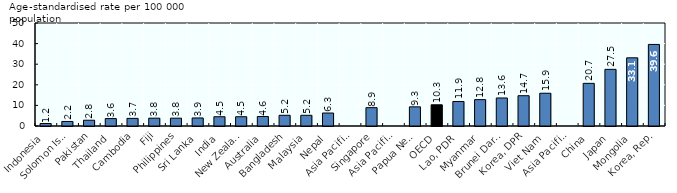
| Category | Total |
|---|---|
| Indonesia | 1.2 |
| Solomon Islands | 2.2 |
| Pakistan | 2.8 |
| Thailand | 3.6 |
| Cambodia | 3.7 |
| Fiji | 3.8 |
| Philippines | 3.8 |
| Sri Lanka | 3.9 |
| India | 4.5 |
| New Zealand | 4.5 |
| Australia | 4.6 |
| Bangladesh | 5.2 |
| Malaysia | 5.2 |
| Nepal | 6.3 |
| Asia Pacific-UM | 7.44 |
| Singapore | 8.9 |
| Asia Pacific-LM/L | 9.1 |
| Papua New Guinea | 9.3 |
| OECD | 10.3 |
| Lao, PDR | 11.9 |
| Myanmar | 12.8 |
| Brunei Darussalam | 13.6 |
| Korea, DPR | 14.7 |
| Viet Nam | 15.9 |
| Asia Pacific-H | 16.45 |
| China | 20.7 |
| Japan | 27.5 |
| Mongolia | 33.1 |
| Korea, Rep. | 39.6 |